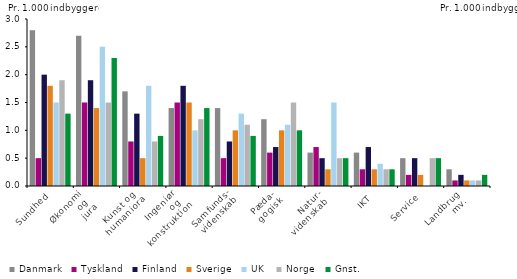
| Category | Danmark | Tyskland | Finland | Sverige | UK | Norge | Gnst. |
|---|---|---|---|---|---|---|---|
| Sundhed | 2.8 | 0.5 | 2 | 1.8 | 1.5 | 1.9 | 1.3 |
| Økonomi 
og 
jura | 2.7 | 1.5 | 1.9 | 1.4 | 2.5 | 1.5 | 2.3 |
| Kunst og 
humaniora | 1.7 | 0.8 | 1.3 | 0.5 | 1.8 | 0.8 | 0.9 |
| Ingeniør 
og 
konstruktion | 1.4 | 1.5 | 1.8 | 1.5 | 1 | 1.2 | 1.4 |
| Samfunds-
videnskab | 1.4 | 0.5 | 0.8 | 1 | 1.3 | 1.1 | 0.9 |
| Pæda-
gogisk | 1.2 | 0.6 | 0.7 | 1 | 1.1 | 1.5 | 1 |
| Natur-
videnskab  | 0.6 | 0.7 | 0.5 | 0.3 | 1.5 | 0.5 | 0.5 |
| IKT | 0.6 | 0.3 | 0.7 | 0.3 | 0.4 | 0.3 | 0.3 |
| Service | 0.5 | 0.2 | 0.5 | 0.2 | 0 | 0.5 | 0.5 |
| Landbrug 
mv. | 0.3 | 0.1 | 0.2 | 0.1 | 0.1 | 0.1 | 0.2 |